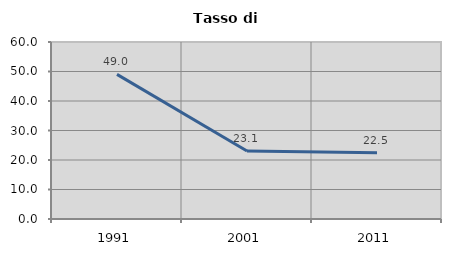
| Category | Tasso di disoccupazione   |
|---|---|
| 1991.0 | 49.031 |
| 2001.0 | 23.052 |
| 2011.0 | 22.484 |